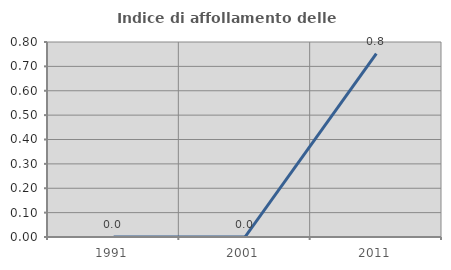
| Category | Indice di affollamento delle abitazioni  |
|---|---|
| 1991.0 | 0 |
| 2001.0 | 0 |
| 2011.0 | 0.752 |